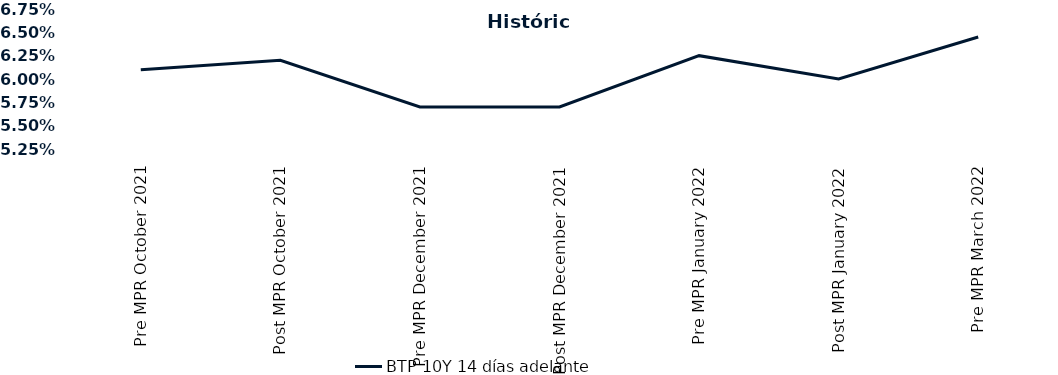
| Category | BTP 10Y 14 días adelante |
|---|---|
| Pre MPR October 2021 | 0.061 |
| Post MPR October 2021 | 0.062 |
| Pre MPR December 2021 | 0.057 |
| Post MPR December 2021 | 0.057 |
| Pre MPR January 2022 | 0.062 |
| Post MPR January 2022 | 0.06 |
| Pre MPR March 2022 | 0.064 |